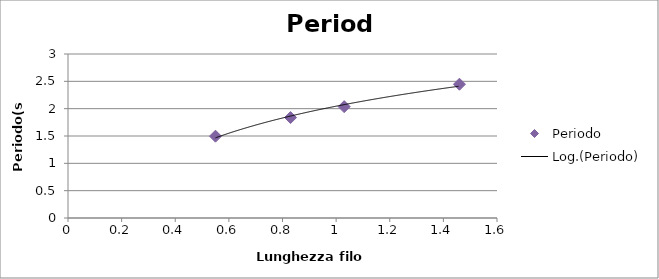
| Category | Periodo |
|---|---|
| 0.55 | 1.496 |
| 0.83 | 1.837 |
| 1.03 | 2.037 |
| 1.46 | 2.447 |